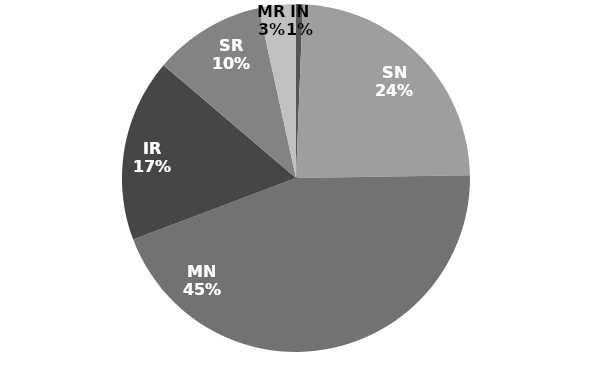
| Category | Series 0 |
|---|---|
| IN | 294046560000000 |
| SN | 11317836446629212 |
| MN | 20877633703094140 |
| IR | 7963137090655123 |
| SR | 4850501334269663 |
| MR | 1612220539828834.8 |